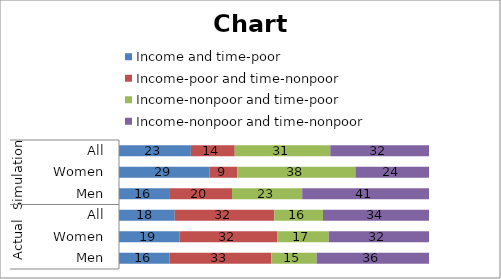
| Category | Income and time-poor | Income-poor and time-nonpoor | Income-nonpoor and time-poor | Income-nonpoor and time-nonpoor |
|---|---|---|---|---|
| 0 | 16.316 | 32.807 | 14.62 | 36.258 |
| 1 | 19.481 | 31.544 | 16.629 | 32.347 |
| 2 | 17.986 | 32.14 | 15.68 | 34.193 |
| 3 | 16.438 | 20.017 | 22.644 | 40.902 |
| 4 | 29.222 | 8.907 | 38.132 | 23.74 |
| 5 | 23.185 | 14.153 | 30.819 | 31.843 |